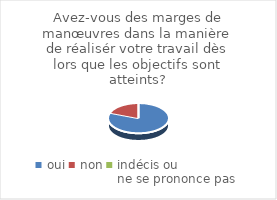
| Category | Avez-vous des marges de manœuvres dans la manière de réalisér votre travail dès lors que les objectifs sont atteints? |
|---|---|
| oui | 63 |
| non | 15 |
| indécis ou 
ne se prononce pas | 0 |